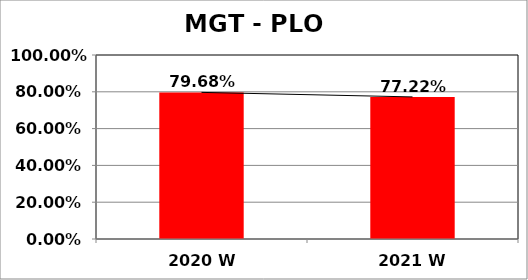
| Category | Series 0 |
|---|---|
| 2020 W | 0.797 |
| 2021 W | 0.772 |